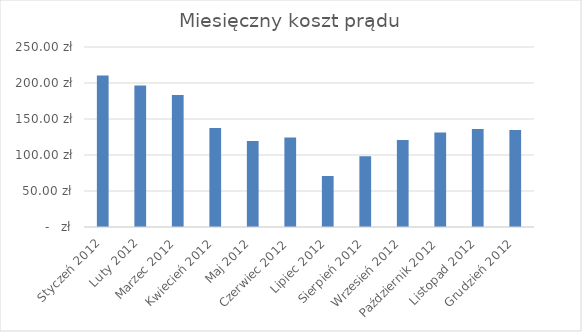
| Category | Series 0 |
|---|---|
| Styczeń 2012 | 210.541 |
| Luty 2012 | 196.683 |
| Marzec 2012 | 183.373 |
| Kwiecień 2012 | 137.402 |
| Maj 2012 | 119.546 |
| Czerwiec 2012 | 124.471 |
| Lipiec 2012 | 70.831 |
| Sierpień 2012 | 98.424 |
| Wrzesień 2012 | 120.908 |
| Październik 2012 | 131.397 |
| Listopad 2012 | 136.24 |
| Grudzień 2012 | 134.653 |